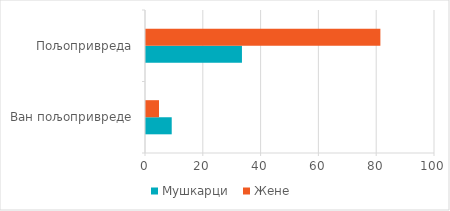
| Category | Мушкарци | Жене |
|---|---|---|
| Ван пољопривреде | 8.9 | 4.5 |
| Пољопривреда | 33.2 | 81.1 |